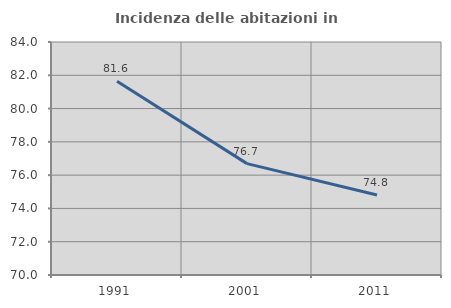
| Category | Incidenza delle abitazioni in proprietà  |
|---|---|
| 1991.0 | 81.641 |
| 2001.0 | 76.692 |
| 2011.0 | 74.809 |